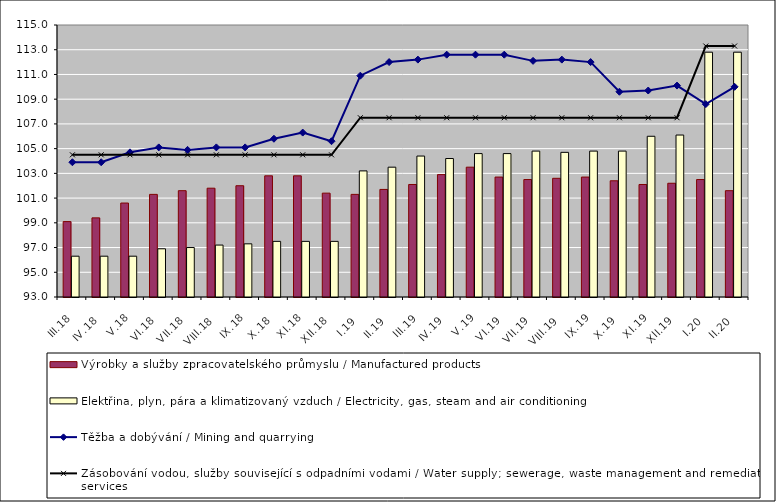
| Category | Výrobky a služby zpracovatelského průmyslu / Manufactured products | Elektřina, plyn, pára a klimatizovaný vzduch / Electricity, gas, steam and air conditioning |
|---|---|---|
| III.18 | 99.1 | 96.3 |
| IV.18 | 99.4 | 96.3 |
| V.18 | 100.6 | 96.3 |
| VI.18 | 101.3 | 96.9 |
| VII.18 | 101.6 | 97 |
| VIII.18 | 101.8 | 97.2 |
| IX.18 | 102 | 97.3 |
| X.18 | 102.8 | 97.5 |
| XI.18 | 102.8 | 97.5 |
| XII.18 | 101.4 | 97.5 |
| I.19 | 101.3 | 103.2 |
| II.19 | 101.7 | 103.5 |
| III.19 | 102.1 | 104.4 |
| IV.19 | 102.9 | 104.2 |
| V.19 | 103.5 | 104.6 |
| VI.19 | 102.7 | 104.6 |
| VII.19 | 102.5 | 104.8 |
| VIII.19 | 102.6 | 104.7 |
| IX.19 | 102.7 | 104.8 |
| X.19 | 102.4 | 104.8 |
| XI.19 | 102.1 | 106 |
| XII.19 | 102.2 | 106.1 |
| I.20 | 102.5 | 112.8 |
| II.20 | 101.6 | 112.8 |